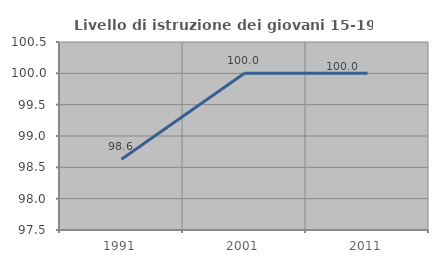
| Category | Livello di istruzione dei giovani 15-19 anni |
|---|---|
| 1991.0 | 98.63 |
| 2001.0 | 100 |
| 2011.0 | 100 |